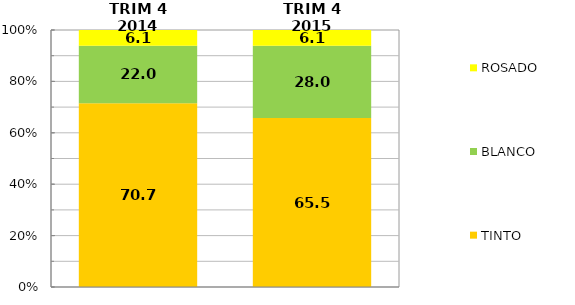
| Category | TINTO | BLANCO | ROSADO |
|---|---|---|---|
| TRIM 4 2014 | 70.704 | 22.027 | 6.093 |
| TRIM 4 2015 | 65.478 | 28.008 | 6.118 |